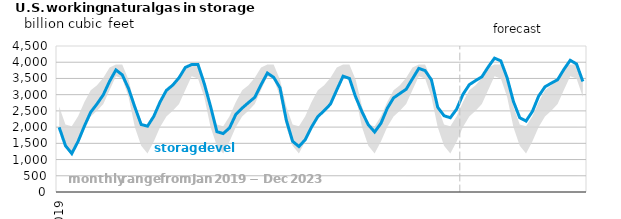
| Category | storage level |
|---|---|
| 2019-01-01 | 1993.996 |
| 2019-02-01 | 1426.21 |
| 2019-03-01 | 1184.89 |
| 2019-04-01 | 1559.401 |
| 2019-05-01 | 2031.031 |
| 2019-06-01 | 2460.748 |
| 2019-07-01 | 2714.196 |
| 2019-08-01 | 2997.81 |
| 2019-09-01 | 3414.939 |
| 2019-10-01 | 3762.043 |
| 2019-11-01 | 3610.029 |
| 2019-12-01 | 3188.243 |
| 2020-01-01 | 2616.175 |
| 2020-02-01 | 2080.883 |
| 2020-03-01 | 2029.359 |
| 2020-04-01 | 2332.493 |
| 2020-05-01 | 2777.584 |
| 2020-06-01 | 3133.095 |
| 2020-07-01 | 3293.549 |
| 2020-08-01 | 3522.216 |
| 2020-09-01 | 3839.836 |
| 2020-10-01 | 3928.503 |
| 2020-11-01 | 3931.616 |
| 2020-12-01 | 3340.981 |
| 2021-01-01 | 2634.967 |
| 2021-02-01 | 1859.218 |
| 2021-03-01 | 1801.225 |
| 2021-04-01 | 1975.033 |
| 2021-05-01 | 2389.891 |
| 2021-06-01 | 2585.126 |
| 2021-07-01 | 2754.714 |
| 2021-08-01 | 2917.268 |
| 2021-09-01 | 3305.982 |
| 2021-10-01 | 3665.385 |
| 2021-11-01 | 3532.775 |
| 2021-12-01 | 3209.982 |
| 2022-01-01 | 2215.941 |
| 2022-02-01 | 1562.018 |
| 2022-03-01 | 1401.465 |
| 2022-04-01 | 1611.765 |
| 2022-05-01 | 2001.915 |
| 2022-06-01 | 2325.321 |
| 2022-07-01 | 2505.122 |
| 2022-08-01 | 2709.422 |
| 2022-09-01 | 3145.643 |
| 2022-10-01 | 3569.384 |
| 2022-11-01 | 3501.05 |
| 2022-12-01 | 2925.38 |
| 2023-01-01 | 2470.015 |
| 2023-02-01 | 2072.183 |
| 2023-03-01 | 1849.895 |
| 2023-04-01 | 2116.461 |
| 2023-05-01 | 2576.48 |
| 2023-06-01 | 2901.661 |
| 2023-07-01 | 3035.196 |
| 2023-08-01 | 3167.947 |
| 2023-09-01 | 3489.832 |
| 2023-10-01 | 3809.382 |
| 2023-11-01 | 3742.245 |
| 2023-12-01 | 3457.481 |
| 2024-01-01 | 2612.095 |
| 2024-02-01 | 2350.331 |
| 2024-03-01 | 2289.315 |
| 2024-04-01 | 2554.942 |
| 2024-05-01 | 3009.73 |
| 2024-06-01 | 3307.03 |
| 2024-07-01 | 3434.219 |
| 2024-08-01 | 3551.334 |
| 2024-09-01 | 3853.897 |
| 2024-10-01 | 4125.256 |
| 2024-11-01 | 4042.312 |
| 2024-12-01 | 3521.444 |
| 2025-01-01 | 2788.11 |
| 2025-02-01 | 2288.757 |
| 2025-03-01 | 2187.141 |
| 2025-04-01 | 2482.15 |
| 2025-05-01 | 2956.963 |
| 2025-06-01 | 3242.861 |
| 2025-07-01 | 3355.205 |
| 2025-08-01 | 3460.901 |
| 2025-09-01 | 3780.403 |
| 2025-10-01 | 4059.376 |
| 2025-11-01 | 3946.004 |
| 2025-12-01 | 3407.082 |